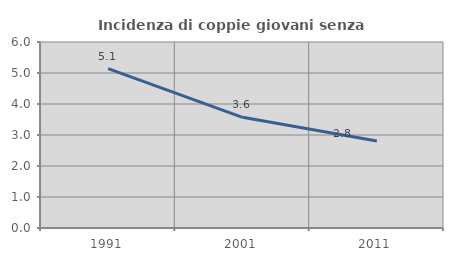
| Category | Incidenza di coppie giovani senza figli |
|---|---|
| 1991.0 | 5.143 |
| 2001.0 | 3.571 |
| 2011.0 | 2.809 |